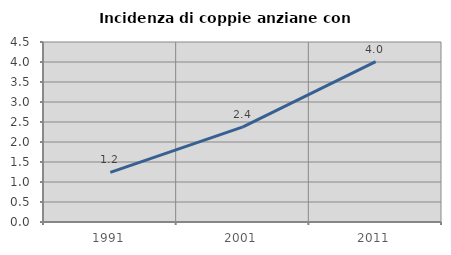
| Category | Incidenza di coppie anziane con figli |
|---|---|
| 1991.0 | 1.241 |
| 2001.0 | 2.377 |
| 2011.0 | 4.009 |